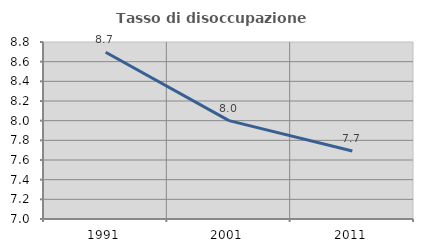
| Category | Tasso di disoccupazione giovanile  |
|---|---|
| 1991.0 | 8.696 |
| 2001.0 | 8 |
| 2011.0 | 7.692 |